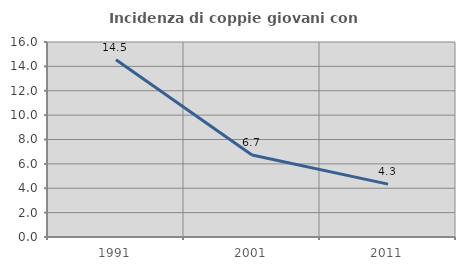
| Category | Incidenza di coppie giovani con figli |
|---|---|
| 1991.0 | 14.545 |
| 2001.0 | 6.726 |
| 2011.0 | 4.338 |